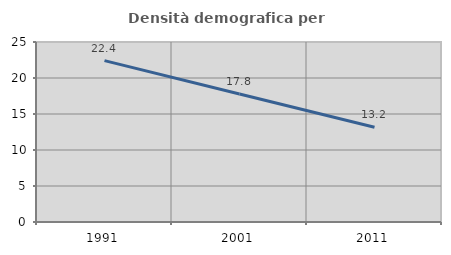
| Category | Densità demografica |
|---|---|
| 1991.0 | 22.409 |
| 2001.0 | 17.781 |
| 2011.0 | 13.154 |